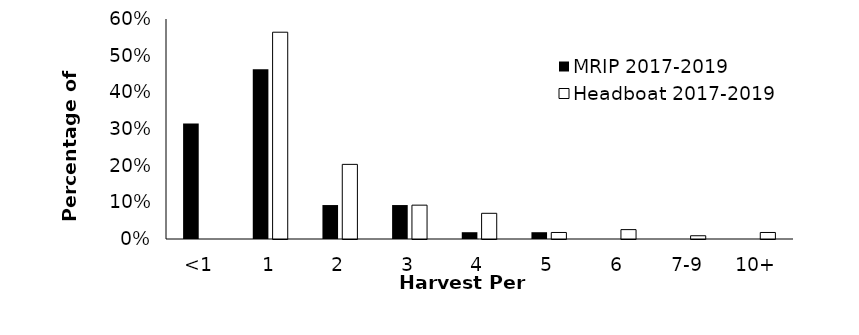
| Category | MRIP 2017-2019 | Headboat 2017-2019 |
|---|---|---|
| <1 | 0.315 | 0 |
| 1 | 0.463 | 0.564 |
| 2 | 0.093 | 0.204 |
| 3 | 0.093 | 0.092 |
| 4 | 0.019 | 0.07 |
| 5 | 0.019 | 0.018 |
| 6 | 0 | 0.026 |
| 7-9 | 0 | 0.009 |
| 10+ | 0 | 0.018 |